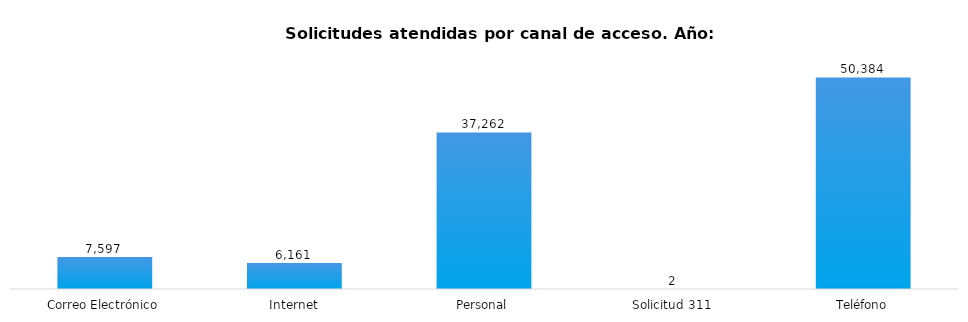
| Category | Total |
|---|---|
| Correo Electrónico | 7597 |
| Internet | 6161 |
| Personal | 37262 |
| Solicitud 311 | 2 |
| Teléfono | 50384 |